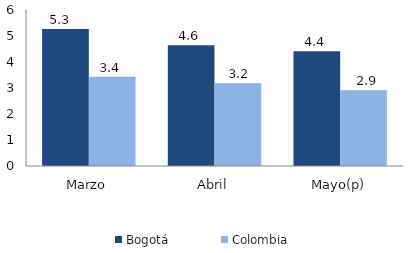
| Category | Bogotá | Colombia |
|---|---|---|
| Marzo | 5.268 | 3.433 |
| Abril | 4.646 | 3.185 |
| Mayo(p) | 4.414 | 2.914 |